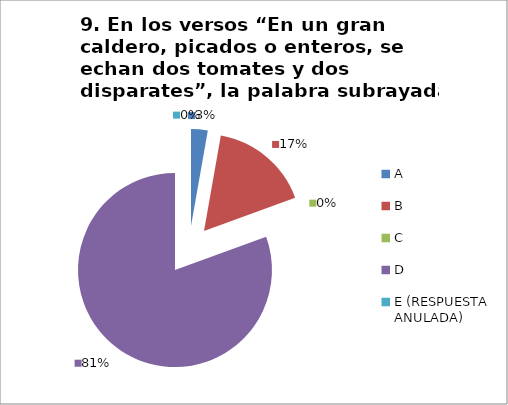
| Category | CANTIDAD DE RESPUESTAS PREGUNTA (9) | PORCENTAJE |
|---|---|---|
| A | 1 | 0.028 |
| B | 6 | 0.167 |
| C | 0 | 0 |
| D | 29 | 0.806 |
| E (RESPUESTA ANULADA) | 0 | 0 |